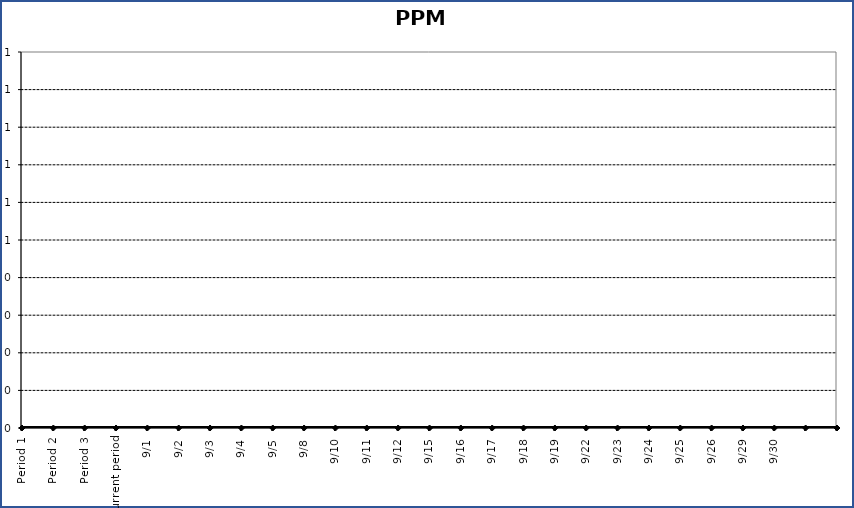
| Category | Series 0 |
|---|---|
| Period 1 | 0 |
| Period 2 | 0 |
| Period 3 | 0 |
| Current period | 0 |
| 9/1 | 0 |
| 9/2 | 0 |
| 9/3 | 0 |
| 9/4 | 0 |
| 9/5 | 0 |
| 9/8 | 0 |
| 9/10 | 0 |
| 9/11 | 0 |
| 9/12 | 0 |
| 9/15 | 0 |
| 9/16 | 0 |
| 9/17 | 0 |
| 9/18 | 0 |
| 9/19 | 0 |
| 9/22 | 0 |
| 9/23 | 0 |
| 9/24 | 0 |
| 9/25 | 0 |
| 9/26 | 0 |
| 9/29 | 0 |
| 9/30 | 0 |